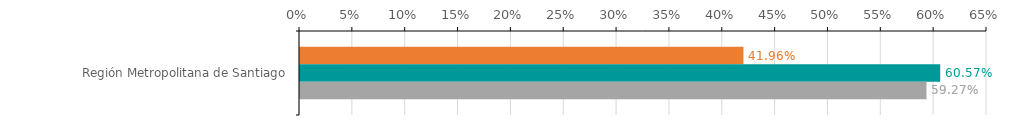
| Category | Numero de operaciones | Monto ($ MM) | Garantia ($ MM) |
|---|---|---|---|
| Región Metropolitana de Santiago | 0.42 | 0.606 | 0.593 |